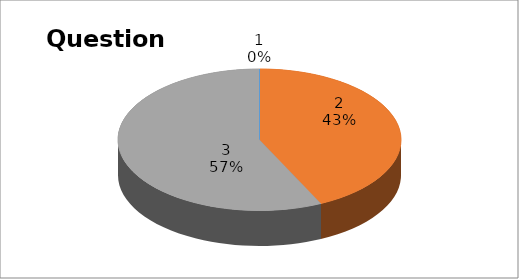
| Category | Series 0 |
|---|---|
| 0 | 0 |
| 1 | 6 |
| 2 | 8 |